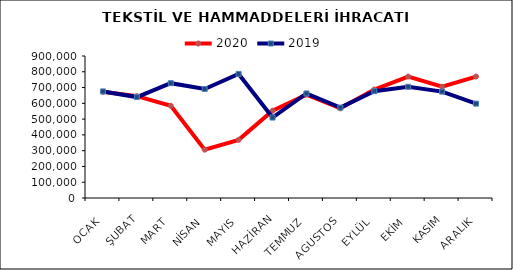
| Category | 2020 | 2019 |
|---|---|---|
| OCAK | 673012.543 | 675582.805 |
| ŞUBAT | 645868.962 | 639694.704 |
| MART | 584618.183 | 727682.44 |
| NİSAN | 306249.943 | 690852.612 |
| MAYIS | 368574.705 | 786323.094 |
| HAZİRAN | 553321.324 | 509902.891 |
| TEMMUZ | 655113.321 | 662615.715 |
| AGUSTOS | 568069.16 | 572846.936 |
| EYLÜL | 687453.07 | 676901.906 |
| EKİM | 769646.115 | 704819.313 |
| KASIM | 705036.887 | 674312.215 |
| ARALIK | 769596.95 | 598053.058 |